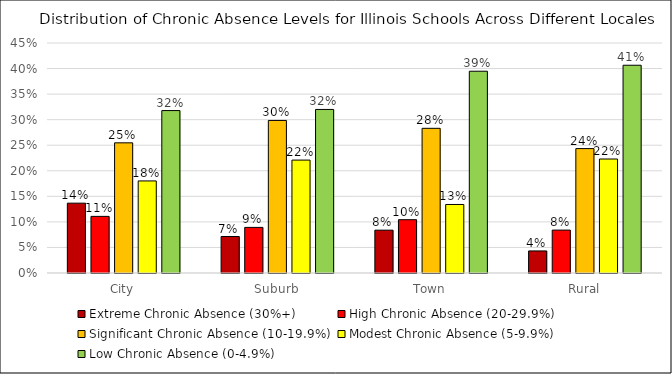
| Category | Extreme Chronic Absence (30%+) | High Chronic Absence (20-29.9%) | Significant Chronic Absence (10-19.9%) | Modest Chronic Absence (5-9.9%) | Low Chronic Absence (0-4.9%) |
|---|---|---|---|---|---|
| City | 0.137 | 0.111 | 0.255 | 0.18 | 0.318 |
| Suburb | 0.071 | 0.089 | 0.298 | 0.221 | 0.32 |
| Town | 0.084 | 0.104 | 0.283 | 0.134 | 0.395 |
| Rural | 0.043 | 0.084 | 0.243 | 0.223 | 0.406 |